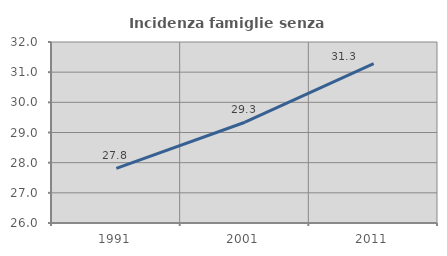
| Category | Incidenza famiglie senza nuclei |
|---|---|
| 1991.0 | 27.811 |
| 2001.0 | 29.341 |
| 2011.0 | 31.286 |